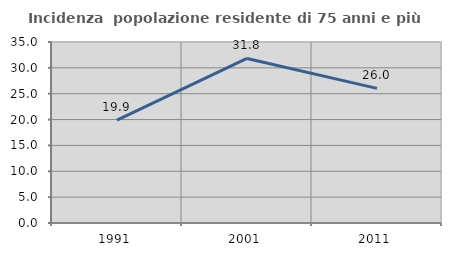
| Category | Incidenza  popolazione residente di 75 anni e più |
|---|---|
| 1991.0 | 19.9 |
| 2001.0 | 31.818 |
| 2011.0 | 26.036 |